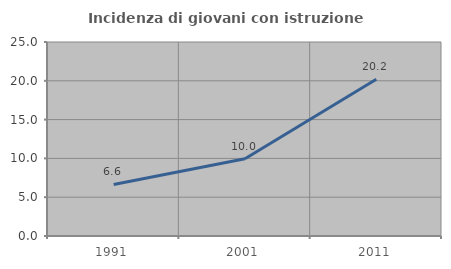
| Category | Incidenza di giovani con istruzione universitaria |
|---|---|
| 1991.0 | 6.649 |
| 2001.0 | 9.96 |
| 2011.0 | 20.211 |